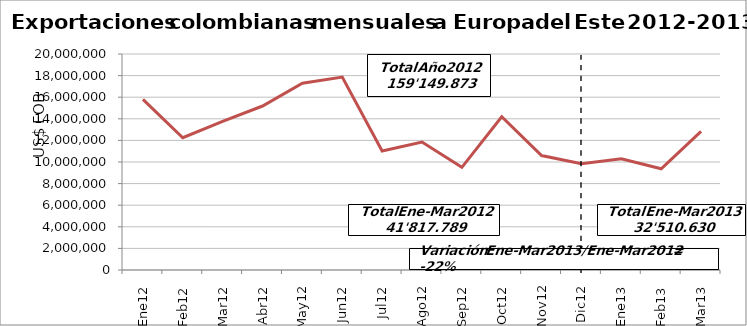
| Category | Series 0 |
|---|---|
| 0 | 15801866 |
| 1 | 12245665 |
| 2 | 13770258 |
| 3 | 15183521 |
| 4 | 17288334 |
| 5 | 17858062 |
| 6 | 11013944 |
| 7 | 11845664 |
| 8 | 9505447 |
| 9 | 14188632 |
| 10 | 10599812 |
| 11 | 9848668 |
| 12 | 10302271.29 |
| 13 | 9369044.9 |
| 14 | 12839313.84 |